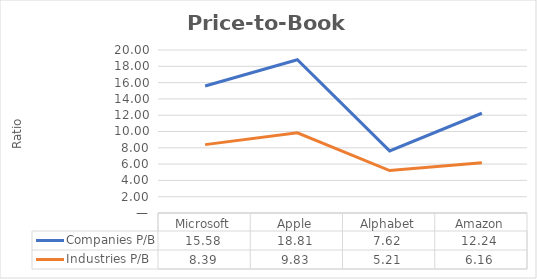
| Category | Companies P/B | Industries P/B |
|---|---|---|
| Microsoft | 15.58 | 8.39 |
| Apple | 18.81 | 9.83 |
| Alphabet | 7.624 | 5.21 |
| Amazon | 12.238 | 6.16 |